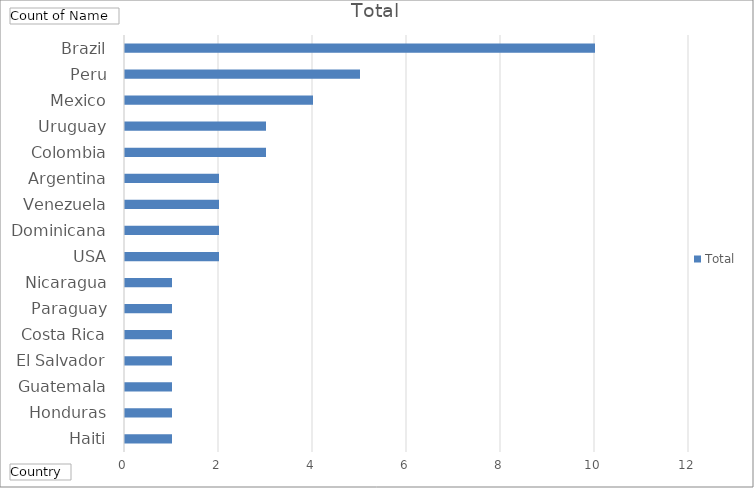
| Category | Total |
|---|---|
| Haiti | 1 |
| Honduras | 1 |
| Guatemala | 1 |
| El Salvador | 1 |
| Costa Rica | 1 |
| Paraguay | 1 |
| Nicaragua | 1 |
| USA | 2 |
| Dominicana | 2 |
| Venezuela | 2 |
| Argentina | 2 |
| Colombia | 3 |
| Uruguay | 3 |
| Mexico | 4 |
| Peru | 5 |
| Brazil | 10 |